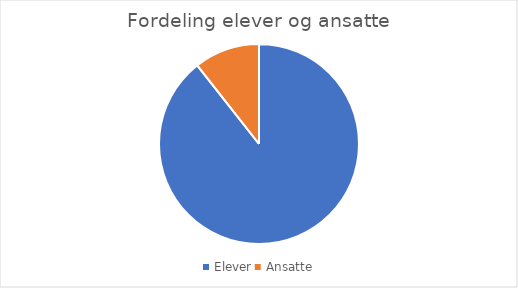
| Category | Series 0 |
|---|---|
| Elever | 708 |
| Ansatte | 84 |